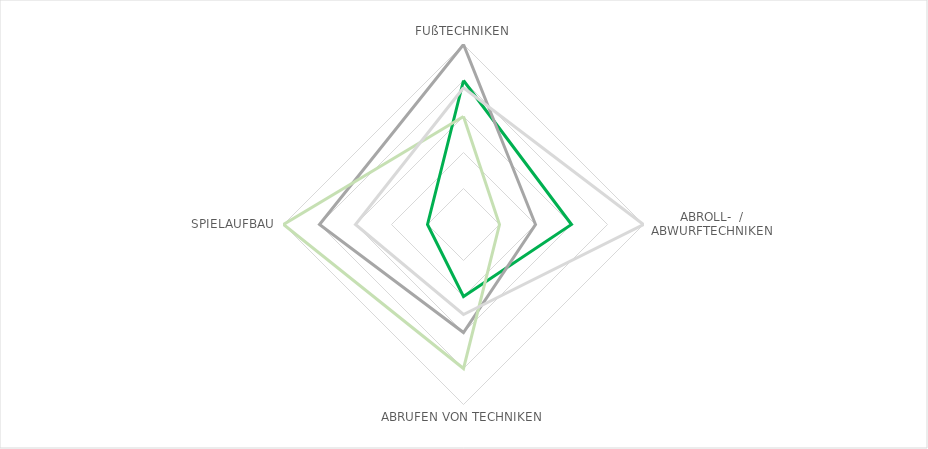
| Category | Series 0 | Series 1 | Series 2 | Series 3 |
|---|---|---|---|---|
| FUßTECHNIKEN | 4 | 5 | 3 | 3.8 |
| ABROLL-  / ABWURFTECHNIKEN | 3 | 2 | 1 | 5 |
| ABRUFEN VON TECHNIKEN | 2 | 3 | 4 | 2.5 |
| SPIELAUFBAU | 1 | 4 | 5 | 3 |